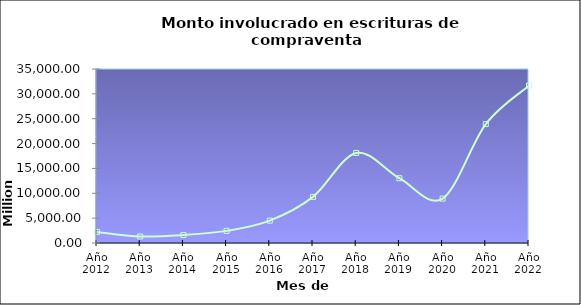
| Category | Series 0 |
|---|---|
| Año 2012 | 2223568554.74 |
| Año 2013 | 1311620107.9 |
| Año 2014 | 1605095742.15 |
| Año 2015 | 2439510780.27 |
| Año 2016 | 4494641664.56 |
| Año 2017 | 9276689920.86 |
| Año 2018 | 18116809023.92 |
| Año 2019 | 13031158789.77 |
| Año 2020 | 8928649450.48 |
| Año 2021 | 23915957005.56 |
| Año 2022 | 31655906688.89 |